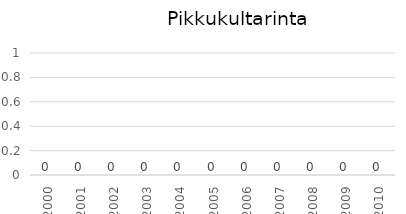
| Category | Series 0 |
|---|---|
| 2000.0 | 0 |
| 2001.0 | 0 |
| 2002.0 | 0 |
| 2003.0 | 0 |
| 2004.0 | 0 |
| 2005.0 | 0 |
| 2006.0 | 0 |
| 2007.0 | 0 |
| 2008.0 | 0 |
| 2009.0 | 0 |
| 2010.0 | 0 |